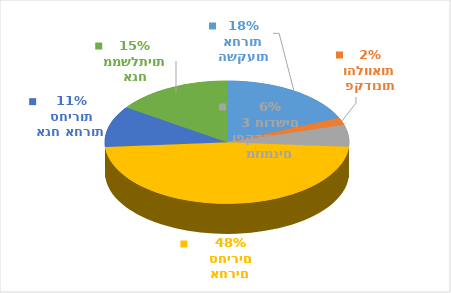
| Category | Series 0 | Series 1 |
|---|---|---|
| השקעות אחרות | 123908.562 | 0.185 |
| פקדונות והלוואות | 12759.906 | 0.019 |
| מזומנים ופקדונות עד 3 חודשים | 38870.818 | 0.058 |
| ניירות ערך אחרים סחירים | 318827.007 | 0.476 |
| אגח אחרות סחירות | 72575.078 | 0.108 |
| אגח ממשלתיות | 103322.154 | 0.154 |